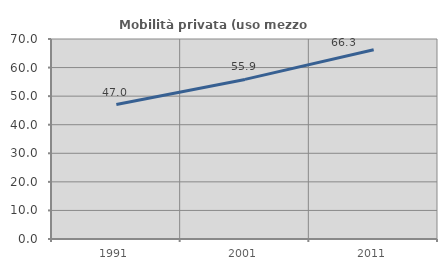
| Category | Mobilità privata (uso mezzo privato) |
|---|---|
| 1991.0 | 47.048 |
| 2001.0 | 55.857 |
| 2011.0 | 66.261 |